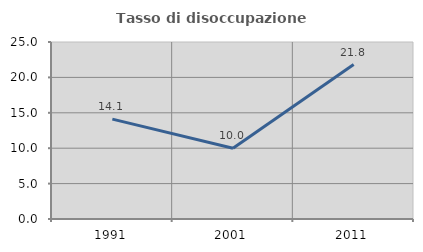
| Category | Tasso di disoccupazione giovanile  |
|---|---|
| 1991.0 | 14.103 |
| 2001.0 | 10 |
| 2011.0 | 21.818 |